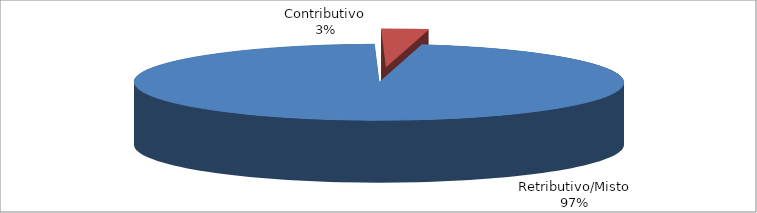
| Category | Series 1 |
|---|---|
| Retributivo/Misto | 29862 |
| Contributivo | 951 |